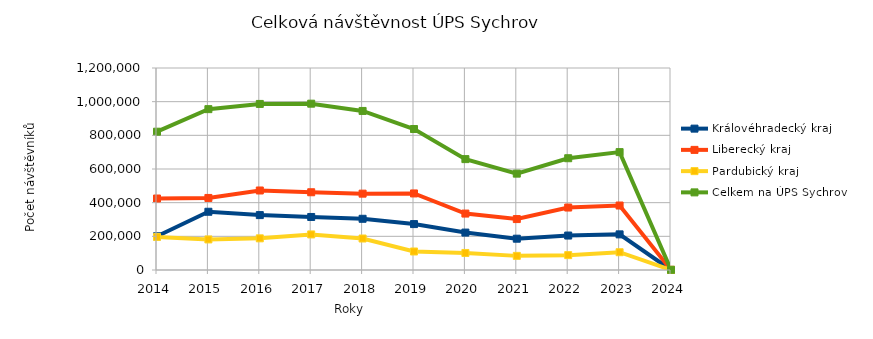
| Category | Královéhradecký kraj | Liberecký kraj | Pardubický kraj | Celkem na ÚPS Sychrov |
|---|---|---|---|---|
| 2014.0 | 200438 | 424718 | 196473 | 821629 |
| 2015.0 | 345970 | 428023 | 181567 | 955560 |
| 2016.0 | 326137 | 472318 | 188108 | 986563 |
| 2017.0 | 314983 | 461803 | 211268 | 988054 |
| 2018.0 | 304267 | 453568 | 187017 | 944852 |
| 2019.0 | 272720 | 454785 | 109949 | 837454 |
| 2020.0 | 222238 | 335261 | 101211 | 658710 |
| 2021.0 | 185934 | 302574 | 83925 | 572433 |
| 2022.0 | 204678 | 371041 | 88282 | 664001 |
| 2023.0 | 211717 | 383004 | 105549 | 700270 |
| 2024.0 | 0 | 989 | 306 | 1295 |